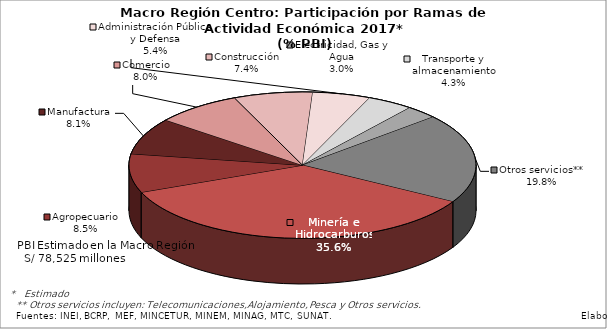
| Category | Series 0 |
|---|---|
| Minería e Hidrocarburos | 27980.001 |
| Agropecuario | 6692.942 |
| Manufactura | 6346.735 |
| Comercio | 6288.227 |
| Construcción | 5781.39 |
| Administración Pública y Defensa | 4235.541 |
| Transporte y almacenamiento | 3355.923 |
| Electricidad, Gas y Agua | 2320.35 |
| Otros servicios** | 15523.87 |